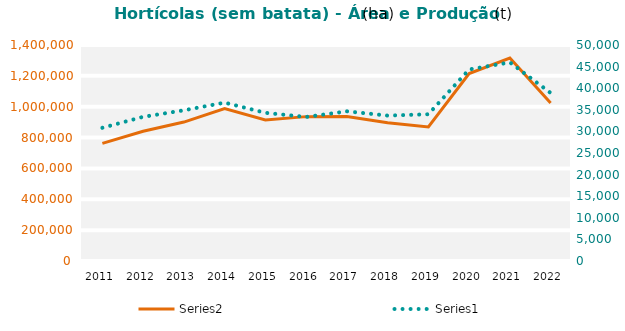
| Category | Series 1 |
|---|---|
| 2011 | 762287 |
| 2012 | 840744 |
| 2013 | 900430 |
| 2014 | 988650 |
| 2015 | 913995 |
| 2016 | 935750 |
| 2017 | 936077 |
| 2018 | 896110 |
| 2019 | 869142 |
| 2020 | 1214815 |
| 2021 | 1315885 |
| 2022 | 1024045 |